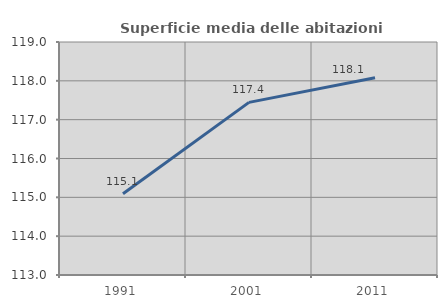
| Category | Superficie media delle abitazioni occupate |
|---|---|
| 1991.0 | 115.092 |
| 2001.0 | 117.446 |
| 2011.0 | 118.082 |